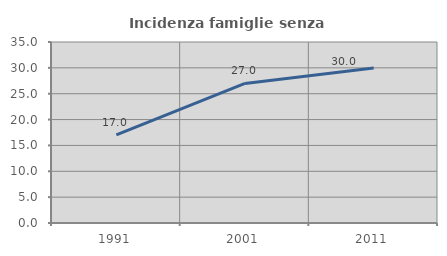
| Category | Incidenza famiglie senza nuclei |
|---|---|
| 1991.0 | 17.025 |
| 2001.0 | 26.996 |
| 2011.0 | 29.956 |